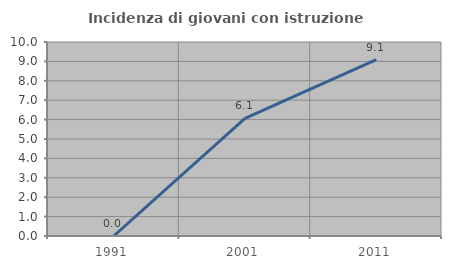
| Category | Incidenza di giovani con istruzione universitaria |
|---|---|
| 1991.0 | 0 |
| 2001.0 | 6.061 |
| 2011.0 | 9.091 |